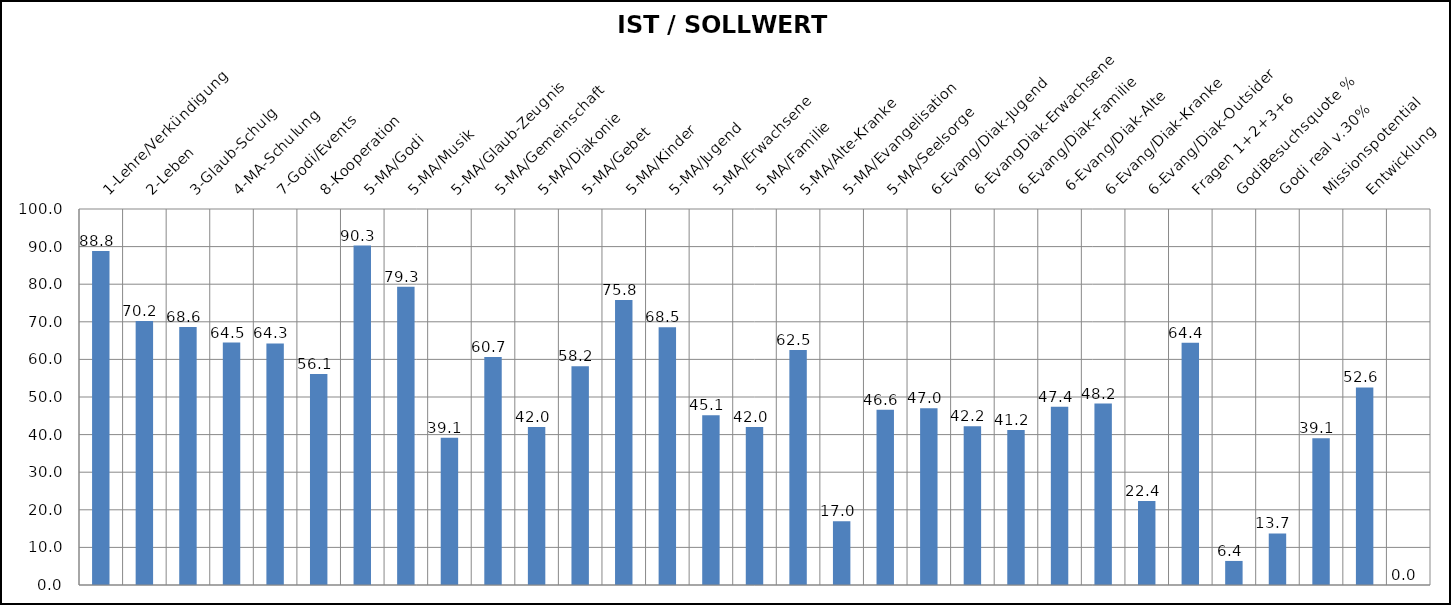
| Category | IST / SOLLWERT % |
|---|---|
| 1-Lehre/Verkündigung  | 88.802 |
| 2-Leben | 70.243 |
| 3-Glaub-Schulg | 68.629 |
| 4-MA-Schulung | 64.462 |
| 7-Godi/Events | 64.25 |
| 8-Kooperation | 56.109 |
| 5-MA/Godi | 90.269 |
| 5-MA/Musik | 79.296 |
| 5-MA/Glaub-Zeugnis | 39.13 |
| 5-MA/Gemeinschaft | 60.663 |
| 5-MA/Diakonie | 42.029 |
| 5-MA/Gebet | 58.178 |
| 5-MA/Kinder | 75.776 |
| 5-MA/Jugend | 68.53 |
| 5-MA/Erwachsene | 45.135 |
| 5-MA/Familie | 42.029 |
| 5-MA/Alte-Kranke | 62.526 |
| 5-MA/Evangelisation | 16.977 |
| 5-MA/Seelsorge | 46.584 |
| 6-Evang/Diak-Jugend | 46.998 |
| 6-EvangDiak-Erwachsene | 42.236 |
| 6-Evang/Diak-Familie | 41.201 |
|  6-Evang/Diak-Alte | 47.412 |
| 6-Evang/Diak-Kranke | 48.24 |
| 6-Evang/Diak-Outsider | 22.36 |
| Fragen 1+2+3+6 | 64.397 |
| GodiBesuchsquote % | 6.4 |
| Godi real v.30% | 13.707 |
| Missionspotential | 39.052 |
| Entwicklung | 52.553 |
|   | 0 |